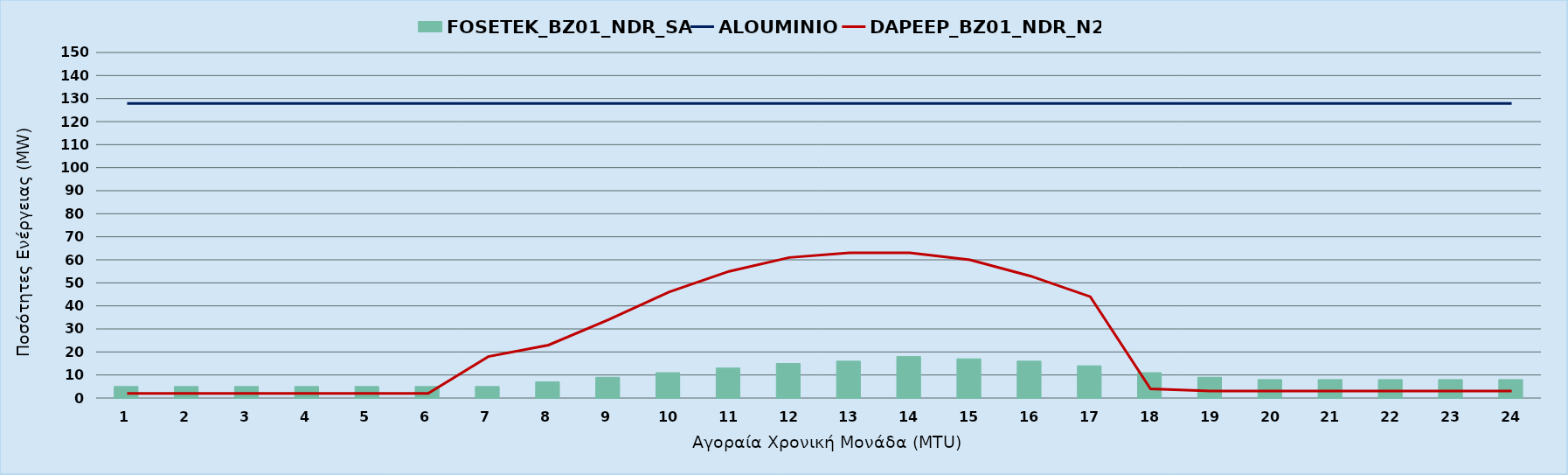
| Category | FOSETEK_BZ01_NDR_SA |
|---|---|
| 0 | 5 |
| 1 | 5 |
| 2 | 5 |
| 3 | 5 |
| 4 | 5 |
| 5 | 5 |
| 6 | 5 |
| 7 | 7 |
| 8 | 9 |
| 9 | 11 |
| 10 | 13 |
| 11 | 15 |
| 12 | 16 |
| 13 | 18 |
| 14 | 17 |
| 15 | 16 |
| 16 | 14 |
| 17 | 11 |
| 18 | 9 |
| 19 | 8 |
| 20 | 8 |
| 21 | 8 |
| 22 | 8 |
| 23 | 8 |